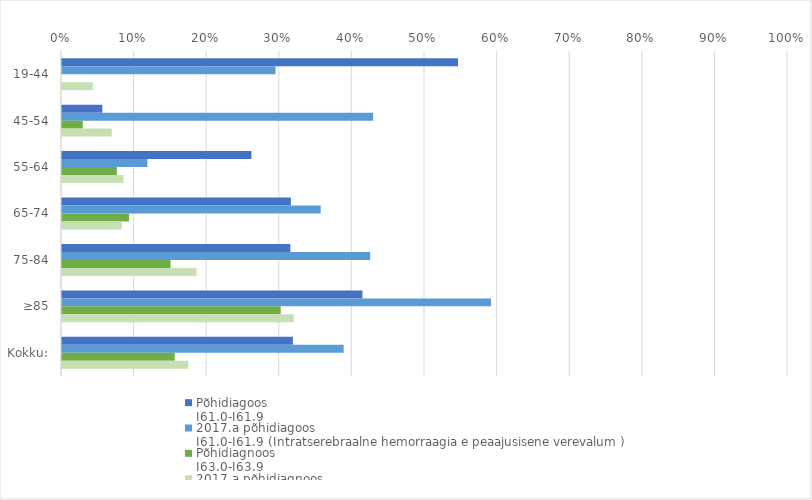
| Category | Põhidiagoos 
I61.0-I61.9  | 2017.a põhidiagoos 
I61.0-I61.9 (Intratserebraalne hemorraagia e peaajusisene verevalum ) | Põhidiagnoos
I63.0-I63.9  | 2017.a põhidiagnoos
I63.0-I63.9 (Peaajuinfarkt) |
|---|---|---|---|---|
| 19-44 | 0.545 | 0.294 | 0 | 0.043 |
| 45-54 | 0.056 | 0.429 | 0.029 | 0.069 |
| 55-64 | 0.261 | 0.118 | 0.076 | 0.084 |
| 65-74 | 0.315 | 0.356 | 0.092 | 0.082 |
| 75-84 | 0.315 | 0.425 | 0.15 | 0.185 |
| ≥85 | 0.414 | 0.591 | 0.301 | 0.319 |
| Kokku: | 0.318 | 0.388 | 0.155 | 0.174 |